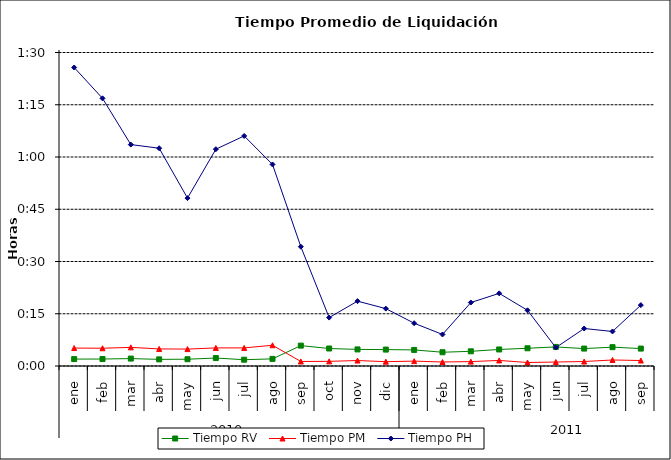
| Category | Tiempo RV | Tiempo PM | Tiempo PH |
|---|---|---|---|
| 0 | 0.001 | 0.004 | 0.06 |
| 1 | 0.001 | 0.004 | 0.053 |
| 2 | 0.001 | 0.004 | 0.044 |
| 3 | 0.001 | 0.003 | 0.043 |
| 4 | 0.001 | 0.003 | 0.033 |
| 5 | 0.002 | 0.004 | 0.043 |
| 6 | 0.001 | 0.004 | 0.046 |
| 7 | 0.001 | 0.004 | 0.04 |
| 8 | 0.004 | 0.001 | 0.024 |
| 9 | 0.003 | 0.001 | 0.01 |
| 10 | 0.003 | 0.001 | 0.013 |
| 11 | 0.003 | 0.001 | 0.011 |
| 12 | 0.003 | 0.001 | 0.009 |
| 13 | 0.003 | 0.001 | 0.006 |
| 14 | 0.003 | 0.001 | 0.013 |
| 15 | 0.003 | 0.001 | 0.014 |
| 16 | 0.004 | 0.001 | 0.011 |
| 17 | 0.004 | 0.001 | 0.004 |
| 18 | 0.003 | 0.001 | 0.007 |
| 19 | 0.004 | 0.001 | 0.007 |
| 20 | 0.003 | 0.001 | 0.012 |